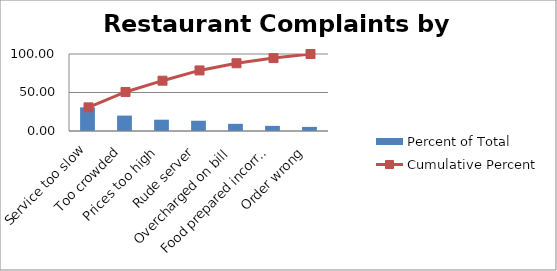
| Category | Percent of Total |
|---|---|
| Service too slow | 30.67 |
| Too crowded | 20 |
| Prices too high | 14.67 |
| Rude server | 13.33 |
| Overcharged on bill | 9.33 |
| Food prepared incorrectly | 6.67 |
| Order wrong | 5.33 |